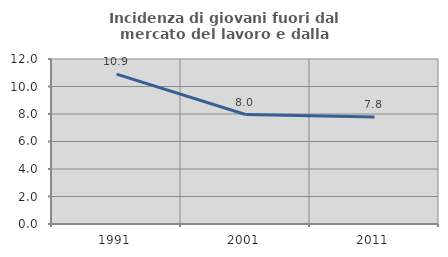
| Category | Incidenza di giovani fuori dal mercato del lavoro e dalla formazione  |
|---|---|
| 1991.0 | 10.904 |
| 2001.0 | 7.96 |
| 2011.0 | 7.78 |